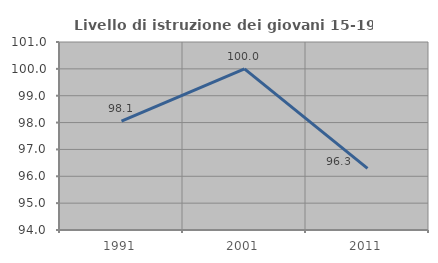
| Category | Livello di istruzione dei giovani 15-19 anni |
|---|---|
| 1991.0 | 98.052 |
| 2001.0 | 100 |
| 2011.0 | 96.296 |